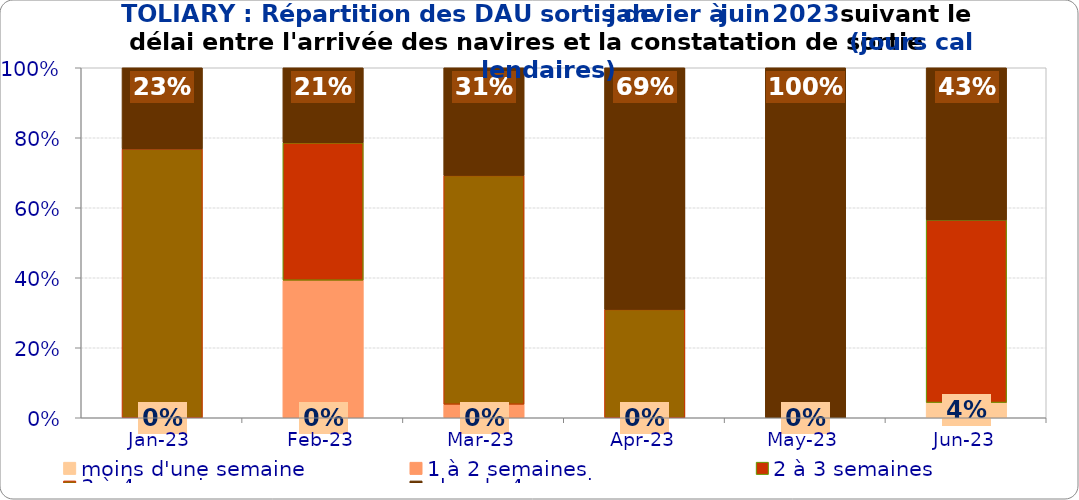
| Category | moins d'une semaine | 1 à 2 semaines | 2 à 3 semaines | 3 à 4 semaines | plus de 4 semaines |
|---|---|---|---|---|---|
| 2023-01-01 | 0 | 0 | 0 | 0.768 | 0.232 |
| 2023-02-01 | 0 | 0.393 | 0.393 | 0 | 0.214 |
| 2023-03-01 | 0 | 0.038 | 0 | 0.654 | 0.308 |
| 2023-04-01 | 0 | 0 | 0 | 0.31 | 0.69 |
| 2023-05-01 | 0 | 0 | 0 | 0 | 1 |
| 2023-06-01 | 0.043 | 0 | 0.522 | 0 | 0.435 |